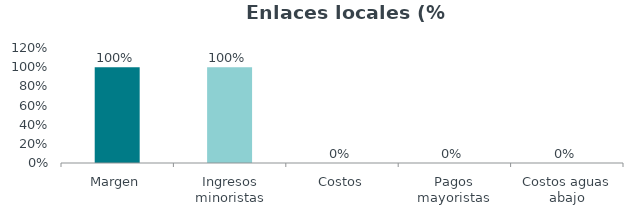
| Category | Series 0 |
|---|---|
| Margen | 1 |
| Ingresos minoristas | 1 |
| Costos | 0 |
| Pagos mayoristas | 0 |
| Costos aguas abajo | 0 |